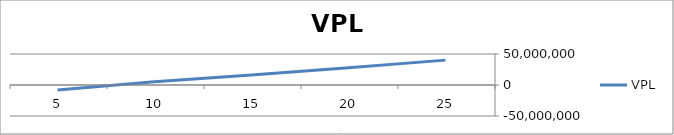
| Category | VPL |
|---|---|
| 25.0 | 40120795.012 |
| 20.0 | 27991508.141 |
| 15.0 | 16164828.178 |
| 10.0 | 5369327.953 |
| 5.0 | -7956775.869 |